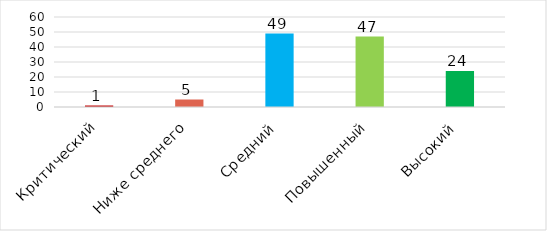
| Category | Series 0 |
|---|---|
| Критический | 1 |
| Ниже среднего | 5 |
| Средний | 49 |
| Повышенный | 47 |
| Высокий | 24 |